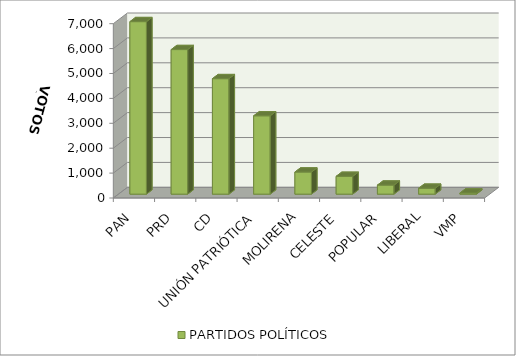
| Category | PARTIDOS POLÍTICOS |
|---|---|
| PAN | 6927 |
| PRD | 5805 |
| CD | 4637 |
| UNIÓN PATRIÓTICA | 3146 |
| MOLIRENA | 887 |
| CELESTE | 715 |
| POPULAR | 362 |
| LIBERAL | 237 |
| VMP | 46 |